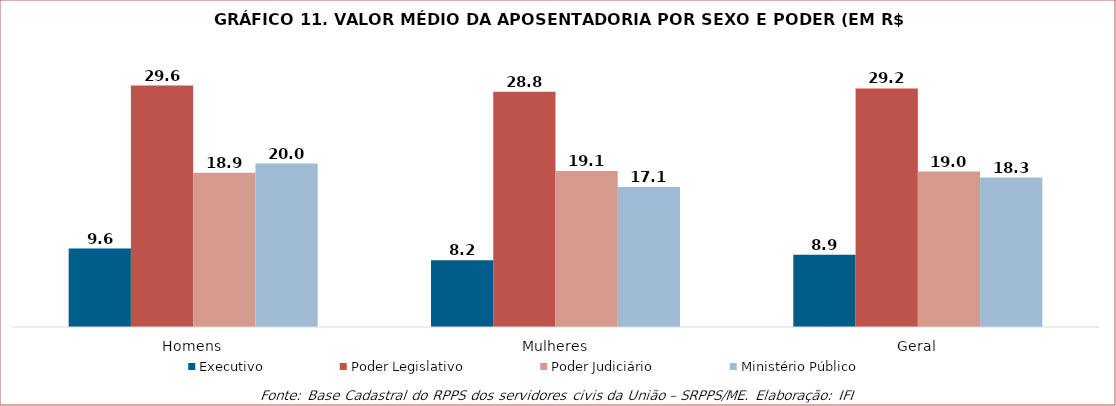
| Category | Executivo | Poder Legislativo | Poder Judiciário | Ministério Público |
|---|---|---|---|---|
| Homens | 9592.746 | 29554.06 | 18863.152 | 19994.131 |
| Mulheres | 8183.121 | 28793.243 | 19105.042 | 17134.589 |
| Geral | 8852.832 | 29195.401 | 19019.153 | 18283.684 |